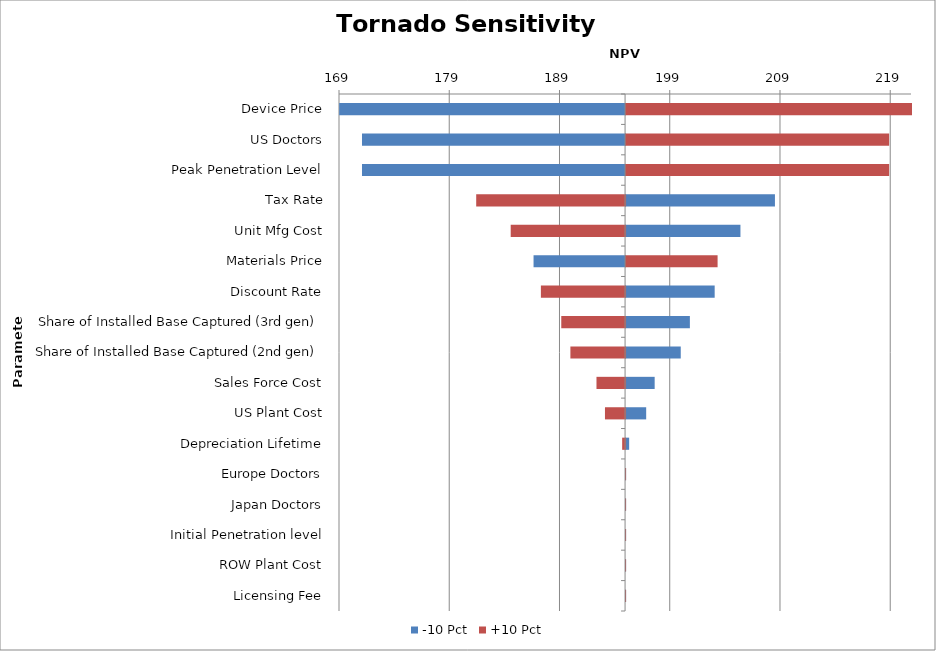
| Category | -10 Pct | +10 Pct |
|---|---|---|
| Device Price | 168.513 | 220.384 |
| US Doctors | 170.586 | 218.311 |
| Peak Penetration Level | 170.586 | 218.311 |
| Tax Rate | 207.952 | 180.945 |
| Unit Mfg Cost | 204.823 | 184.074 |
| Materials Price | 186.147 | 202.75 |
| Discount Rate | 202.485 | 186.812 |
| Share of Installed Base Captured (3rd gen) | 200.236 | 188.661 |
| Share of Installed Base Captured (2nd gen) | 199.408 | 189.489 |
| Sales Force Cost | 197.042 | 191.855 |
| US Plant Cost | 196.273 | 192.624 |
| Depreciation Lifetime | 194.728 | 194.185 |
| Europe Doctors | 194.449 | 194.449 |
| Japan Doctors | 194.449 | 194.449 |
| Initial Penetration level | 194.449 | 194.449 |
| ROW Plant Cost | 194.449 | 194.449 |
| Licensing Fee | 194.449 | 194.449 |